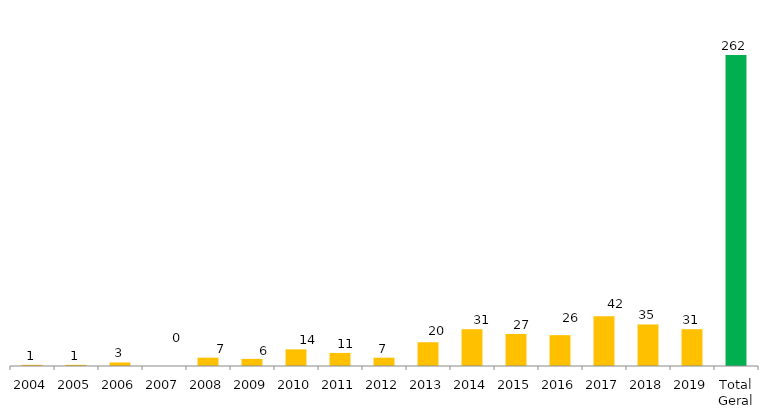
| Category | Categoria/Ano |
|---|---|
| 2004 | 1 |
| 2005 | 1 |
| 2006 | 3 |
| 2007 | 0 |
| 2008 | 7 |
| 2009 | 6 |
| 2010 | 14 |
| 2011 | 11 |
| 2012 | 7 |
| 2013 | 20 |
| 2014 | 31 |
| 2015 | 27 |
| 2016 | 26 |
| 2017 | 42 |
| 2018 | 35 |
| 2019 | 31 |
| Total Geral | 262 |